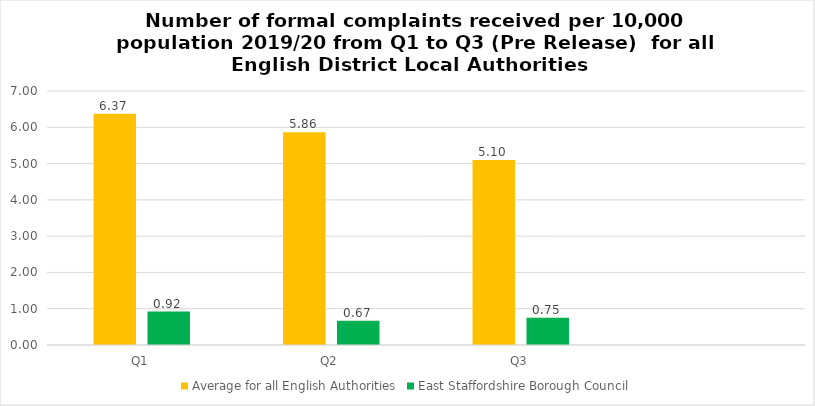
| Category | Average for all English Authorities | East Staffordshire Borough Council |
|---|---|---|
| Q1 | 6.371 | 0.92 |
| Q2 | 5.863 | 0.67 |
| Q3 | 5.1 | 0.75 |